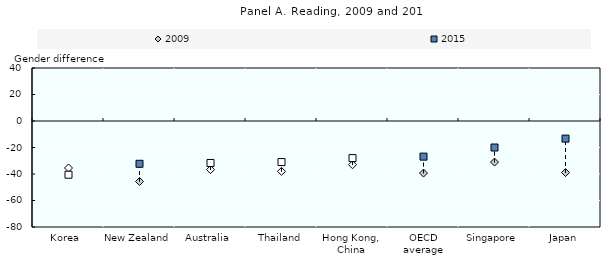
| Category | 2009 | 2015 |
|---|---|---|
| Korea | -35.479 | -40.54 |
| New Zealand | -45.651 | -32.294 |
| Australia | -36.71 | -31.68 |
| Thailand | -38 | -31 |
| Hong Kong, China | -33 | -28 |
| OECD average | -39.298 | -26.895 |
| Singapore | -31 | -20 |
| Japan | -38.912 | -13.281 |